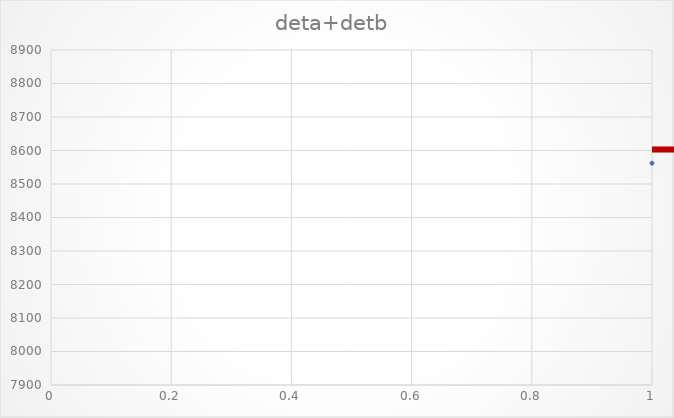
| Category | deta+detb |
|---|---|
| 0 | 8562 |
| 1 | 8431 |
| 2 | 8510 |
| 3 | 8716 |
| 4 | 8582 |
| 5 | 8702 |
| 6 | 8538 |
| 7 | 8512 |
| 8 | 8727 |
| 9 | 8479 |
| 10 | 8623 |
| 11 | 8674 |
| 12 | 8824 |
| 13 | 8702 |
| 14 | 8517 |
| 15 | 8574 |
| 16 | 8535 |
| 17 | 8523 |
| 18 | 8541 |
| 19 | 8463 |
| 20 | 8549 |
| 21 | 8546 |
| 22 | 8550 |
| 23 | 8470 |
| 24 | 8719 |
| 25 | 8640 |
| 26 | 8502 |
| 27 | 8588 |
| 28 | 8594 |
| 29 | 8754 |
| 30 | 8602 |
| 31 | 8356 |
| 32 | 8579 |
| 33 | 8555 |
| 34 | 8499 |
| 35 | 8538 |
| 36 | 8581 |
| 37 | 8456 |
| 38 | 8554 |
| 39 | 8422 |
| 40 | 8744 |
| 41 | 8574 |
| 42 | 8600 |
| 43 | 8593 |
| 44 | 8521 |
| 45 | 8599 |
| 46 | 8662 |
| 47 | 8392 |
| 48 | 8546 |
| 49 | 8674 |
| 50 | 8599 |
| 51 | 8607 |
| 52 | 8596 |
| 53 | 8656 |
| 54 | 8485 |
| 55 | 8459 |
| 56 | 8427 |
| 57 | 8587 |
| 58 | 8561 |
| 59 | 8473 |
| 60 | 8810 |
| 61 | 8426 |
| 62 | 8677 |
| 63 | 8711 |
| 64 | 8442 |
| 65 | 8514 |
| 66 | 8511 |
| 67 | 8724 |
| 68 | 8683 |
| 69 | 8754 |
| 70 | 8471 |
| 71 | 8652 |
| 72 | 8563 |
| 73 | 8426 |
| 74 | 8566 |
| 75 | 8519 |
| 76 | 8488 |
| 77 | 8833 |
| 78 | 8771 |
| 79 | 8568 |
| 80 | 8612 |
| 81 | 8413 |
| 82 | 8337 |
| 83 | 8712 |
| 84 | 8381 |
| 85 | 8635 |
| 86 | 8456 |
| 87 | 8432 |
| 88 | 8464 |
| 89 | 8547 |
| 90 | 8654 |
| 91 | 8471 |
| 92 | 8611 |
| 93 | 8602 |
| 94 | 8532 |
| 95 | 8485 |
| 96 | 8607 |
| 97 | 8347 |
| 98 | 8695 |
| 99 | 8571 |
| 100 | 8610 |
| 101 | 8500 |
| 102 | 8435 |
| 103 | 8640 |
| 104 | 8250 |
| 105 | 8629 |
| 106 | 8363 |
| 107 | 8701 |
| 108 | 8535 |
| 109 | 8625 |
| 110 | 8394 |
| 111 | 8424 |
| 112 | 8611 |
| 113 | 8605 |
| 114 | 8494 |
| 115 | 8547 |
| 116 | 8408 |
| 117 | 8352 |
| 118 | 8442 |
| 119 | 8570 |
| 120 | 8773 |
| 121 | 8590 |
| 122 | 8504 |
| 123 | 8457 |
| 124 | 8580 |
| 125 | 8567 |
| 126 | 8350 |
| 127 | 8342 |
| 128 | 8611 |
| 129 | 8474 |
| 130 | 8566 |
| 131 | 8528 |
| 132 | 8345 |
| 133 | 8417 |
| 134 | 8713 |
| 135 | 8518 |
| 136 | 8418 |
| 137 | 8483 |
| 138 | 8540 |
| 139 | 8419 |
| 140 | 8282 |
| 141 | 8521 |
| 142 | 8328 |
| 143 | 8760 |
| 144 | 8437 |
| 145 | 8468 |
| 146 | 8698 |
| 147 | 8596 |
| 148 | 8336 |
| 149 | 8563 |
| 150 | 8648 |
| 151 | 8477 |
| 152 | 8586 |
| 153 | 8315 |
| 154 | 8471 |
| 155 | 8621 |
| 156 | 8574 |
| 157 | 8514 |
| 158 | 8531 |
| 159 | 8566 |
| 160 | 8349 |
| 161 | 8364 |
| 162 | 8499 |
| 163 | 8594 |
| 164 | 8558 |
| 165 | 8463 |
| 166 | 8569 |
| 167 | 8521 |
| 168 | 8409 |
| 169 | 8504 |
| 170 | 8568 |
| 171 | 8370 |
| 172 | 8497 |
| 173 | 8624 |
| 174 | 8537 |
| 175 | 8298 |
| 176 | 8444 |
| 177 | 8380 |
| 178 | 8381 |
| 179 | 8611 |
| 180 | 8554 |
| 181 | 8498 |
| 182 | 8430 |
| 183 | 8563 |
| 184 | 8605 |
| 185 | 8475 |
| 186 | 8629 |
| 187 | 8523 |
| 188 | 8620 |
| 189 | 8535 |
| 190 | 8519 |
| 191 | 8389 |
| 192 | 8515 |
| 193 | 8402 |
| 194 | 8293 |
| 195 | 8516 |
| 196 | 8511 |
| 197 | 8596 |
| 198 | 8512 |
| 199 | 8392 |
| 200 | 8310 |
| 201 | 8429 |
| 202 | 8435 |
| 203 | 8335 |
| 204 | 8481 |
| 205 | 8421 |
| 206 | 8428 |
| 207 | 8517 |
| 208 | 8493 |
| 209 | 8542 |
| 210 | 8609 |
| 211 | 8451 |
| 212 | 8302 |
| 213 | 8495 |
| 214 | 8610 |
| 215 | 8715 |
| 216 | 8547 |
| 217 | 8389 |
| 218 | 8441 |
| 219 | 8433 |
| 220 | 8480 |
| 221 | 8447 |
| 222 | 8349 |
| 223 | 8484 |
| 224 | 8544 |
| 225 | 8612 |
| 226 | 8492 |
| 227 | 8375 |
| 228 | 8442 |
| 229 | 8376 |
| 230 | 8674 |
| 231 | 8299 |
| 232 | 8413 |
| 233 | 8394 |
| 234 | 8675 |
| 235 | 8377 |
| 236 | 8598 |
| 237 | 8480 |
| 238 | 8437 |
| 239 | 8507 |
| 240 | 8536 |
| 241 | 8637 |
| 242 | 8369 |
| 243 | 8390 |
| 244 | 8322 |
| 245 | 8558 |
| 246 | 8519 |
| 247 | 8518 |
| 248 | 8474 |
| 249 | 8413 |
| 250 | 8585 |
| 251 | 8558 |
| 252 | 8488 |
| 253 | 8605 |
| 254 | 8416 |
| 255 | 8304 |
| 256 | 8447 |
| 257 | 8479 |
| 258 | 8542 |
| 259 | 8291 |
| 260 | 8416 |
| 261 | 8508 |
| 262 | 8563 |
| 263 | 8391 |
| 264 | 8226 |
| 265 | 8347 |
| 266 | 8458 |
| 267 | 8316 |
| 268 | 8307 |
| 269 | 8466 |
| 270 | 8300 |
| 271 | 8378 |
| 272 | 8309 |
| 273 | 8341 |
| 274 | 8517 |
| 275 | 8375 |
| 276 | 8254 |
| 277 | 8326 |
| 278 | 8170 |
| 279 | 8398 |
| 280 | 8316 |
| 281 | 8415 |
| 282 | 8294 |
| 283 | 8336 |
| 284 | 8572 |
| 285 | 8206 |
| 286 | 8484 |
| 287 | 8560 |
| 288 | 8556 |
| 289 | 8290 |
| 290 | 8425 |
| 291 | 8448 |
| 292 | 8453 |
| 293 | 8487 |
| 294 | 8266 |
| 295 | 8412 |
| 296 | 8524 |
| 297 | 8344 |
| 298 | 8429 |
| 299 | 8284 |
| 300 | 8406 |
| 301 | 8139 |
| 302 | 8441 |
| 303 | 8721 |
| 304 | 8335 |
| 305 | 8413 |
| 306 | 8318 |
| 307 | 8377 |
| 308 | 8479 |
| 309 | 8369 |
| 310 | 8522 |
| 311 | 8486 |
| 312 | 8385 |
| 313 | 8375 |
| 314 | 8481 |
| 315 | 8498 |
| 316 | 8411 |
| 317 | 8417 |
| 318 | 8248 |
| 319 | 8516 |
| 320 | 8434 |
| 321 | 8609 |
| 322 | 8377 |
| 323 | 8307 |
| 324 | 8380 |
| 325 | 8175 |
| 326 | 8416 |
| 327 | 8356 |
| 328 | 8285 |
| 329 | 8191 |
| 330 | 8444 |
| 331 | 8257 |
| 332 | 8401 |
| 333 | 8370 |
| 334 | 8241 |
| 335 | 8489 |
| 336 | 8431 |
| 337 | 8296 |
| 338 | 8267 |
| 339 | 8345 |
| 340 | 8150 |
| 341 | 8356 |
| 342 | 8022 |
| 343 | 8446 |
| 344 | 8348 |
| 345 | 8371 |
| 346 | 8464 |
| 347 | 8577 |
| 348 | 8263 |
| 349 | 8460 |
| 350 | 8335 |